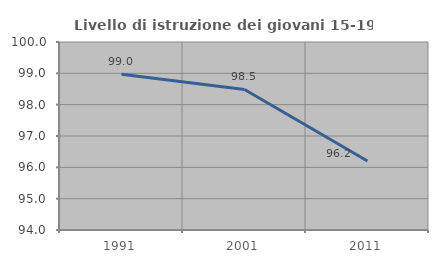
| Category | Livello di istruzione dei giovani 15-19 anni |
|---|---|
| 1991.0 | 98.969 |
| 2001.0 | 98.485 |
| 2011.0 | 96.203 |